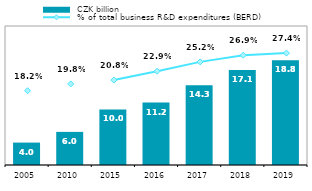
| Category |  CZK billion |
|---|---|
| 2005.0 | 4.033 |
| 2010.0 | 5.956 |
| 2015.0 | 10 |
| 2016.0 | 11.234 |
| 2017.0 | 14.33 |
| 2018.0 | 17.101 |
| 2019.0 | 18.83 |